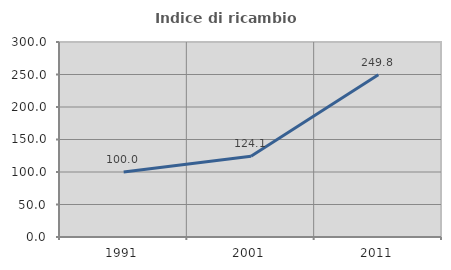
| Category | Indice di ricambio occupazionale  |
|---|---|
| 1991.0 | 100 |
| 2001.0 | 124.149 |
| 2011.0 | 249.761 |